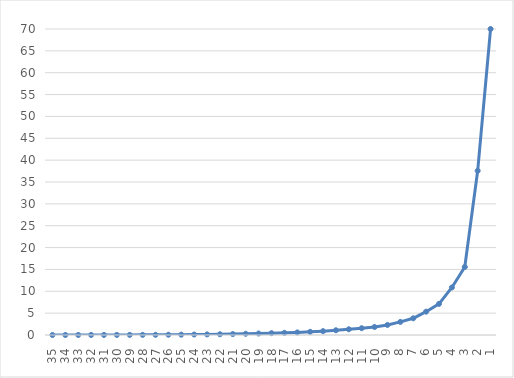
| Category | Series 0 |
|---|---|
| 35.0 | 0.001 |
| 34.0 | 0.002 |
| 33.0 | 0.006 |
| 32.0 | 0.01 |
| 31.0 | 0.014 |
| 30.0 | 0.019 |
| 29.0 | 0.024 |
| 28.0 | 0.034 |
| 27.0 | 0.046 |
| 26.0 | 0.063 |
| 25.0 | 0.079 |
| 24.0 | 0.107 |
| 23.0 | 0.137 |
| 22.0 | 0.172 |
| 21.0 | 0.21 |
| 20.0 | 0.276 |
| 19.0 | 0.343 |
| 18.0 | 0.418 |
| 17.0 | 0.498 |
| 16.0 | 0.59 |
| 15.0 | 0.73 |
| 14.0 | 0.883 |
| 13.0 | 1.082 |
| 12.0 | 1.309 |
| 11.0 | 1.554 |
| 10.0 | 1.826 |
| 9.0 | 2.302 |
| 8.0 | 3 |
| 7.0 | 3.821 |
| 6.0 | 5.336 |
| 5.0 | 7.124 |
| 4.0 | 10.875 |
| 3.0 | 15.561 |
| 2.0 | 37.569 |
| 1.0 | 70 |